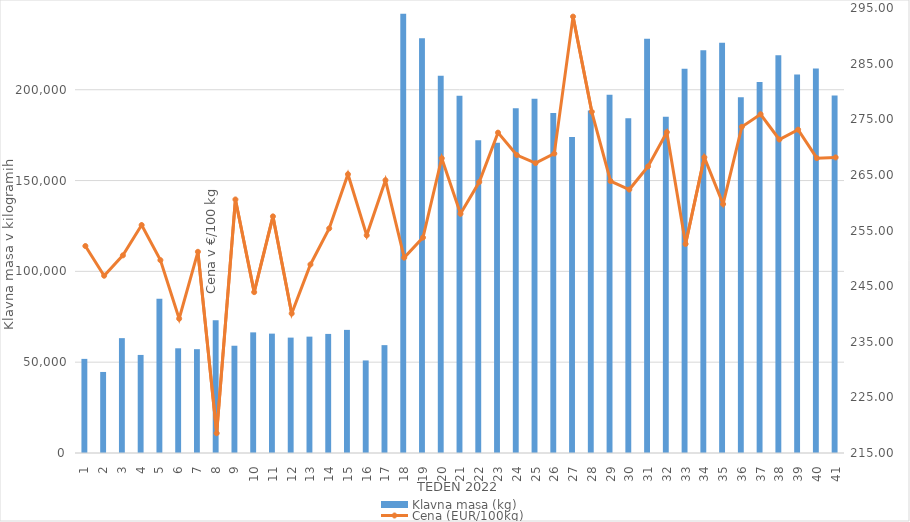
| Category | Klavna masa (kg) |
|---|---|
| 1.0 | 51818 |
| 2.0 | 44619 |
| 3.0 | 63233 |
| 4.0 | 53993 |
| 5.0 | 84871 |
| 6.0 | 57648 |
| 7.0 | 57159 |
| 8.0 | 73139 |
| 9.0 | 59056 |
| 10.0 | 66417 |
| 11.0 | 65723 |
| 12.0 | 63530 |
| 13.0 | 64069 |
| 14.0 | 65564 |
| 15.0 | 67787 |
| 16.0 | 50958 |
| 17.0 | 59387 |
| 18.0 | 241833 |
| 19.0 | 228389 |
| 20.0 | 207661 |
| 21.0 | 196732 |
| 22.0 | 172190 |
| 23.0 | 170751 |
| 24.0 | 189775 |
| 25.0 | 195029 |
| 26.0 | 187239 |
| 27.0 | 173967 |
| 28.0 | 188601 |
| 29.0 | 197293 |
| 30.0 | 184259 |
| 31.0 | 228023 |
| 32.0 | 185079 |
| 33.0 | 211612 |
| 34.0 | 221748 |
| 35.0 | 225927 |
| 36.0 | 195924 |
| 37.0 | 204224 |
| 38.0 | 218966 |
| 39.0 | 208403 |
| 40.0 | 211635 |
| 41.0 | 196841 |